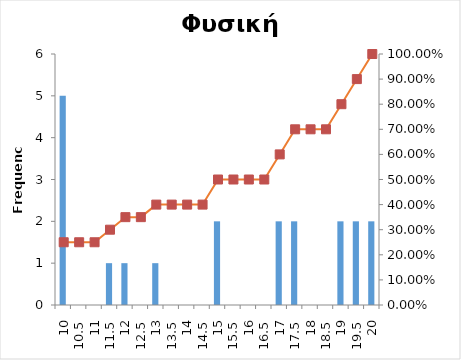
| Category | Series 0 |
|---|---|
| 10 | 5 |
| 10,5 | 0 |
| 11 | 0 |
| 11,5 | 1 |
| 12 | 1 |
| 12,5 | 0 |
| 13 | 1 |
| 13,5 | 0 |
| 14 | 0 |
| 14,5 | 0 |
| 15 | 2 |
| 15,5 | 0 |
| 16 | 0 |
| 16,5 | 0 |
| 17 | 2 |
| 17,5 | 2 |
| 18 | 0 |
| 18,5 | 0 |
| 19 | 2 |
| 19,5 | 2 |
| 20 | 2 |